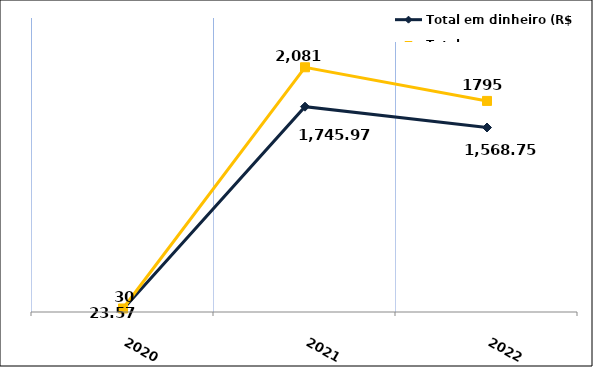
| Category | Total em dinheiro (R$) |
|---|---|
| 2020.0 | 23.57 |
| 2021.0 | 1745.97 |
| 2022.0 | 1568.75 |